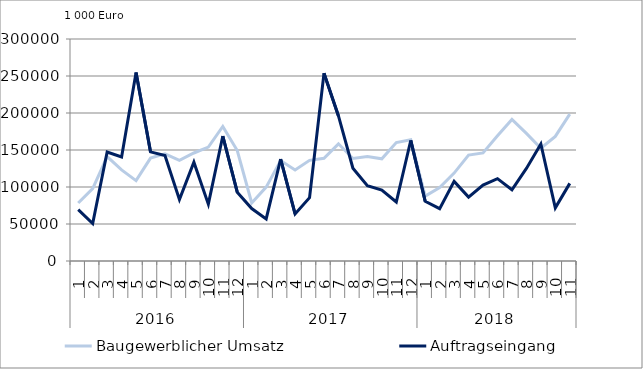
| Category | Baugewerblicher Umsatz | Auftragseingang |
|---|---|---|
| 0 | 78291.738 | 69470.357 |
| 1 | 97863.379 | 50640.033 |
| 2 | 141176.119 | 147206.65 |
| 3 | 123121.297 | 140579.009 |
| 4 | 108561.124 | 254739.334 |
| 5 | 139030.209 | 147481.644 |
| 6 | 144784.416 | 142609.658 |
| 7 | 135870.195 | 83192.156 |
| 8 | 145961.738 | 133594.351 |
| 9 | 153886.826 | 76793.838 |
| 10 | 181740.037 | 168867.568 |
| 11 | 149348.138 | 93011.853 |
| 12 | 78446.78 | 70908.903 |
| 13 | 99841.908 | 56868.408 |
| 14 | 135679.867 | 137790.423 |
| 15 | 123004.403 | 63637.761 |
| 16 | 136010.071 | 85644.63 |
| 17 | 138859.308 | 253791.552 |
| 18 | 158353.879 | 196034.198 |
| 19 | 138510.315 | 125319.873 |
| 20 | 141109.925 | 101690.626 |
| 21 | 138067.098 | 95966.626 |
| 22 | 160064.454 | 79701.993 |
| 23 | 163969.017 | 162878.607 |
| 24 | 87640.529 | 80684.627 |
| 25 | 99259.455 | 70746.763 |
| 26 | 118764.324 | 107538.747 |
| 27 | 143144.178 | 86374.619 |
| 28 | 146070.782 | 102661.329 |
| 29 | 169150.753 | 111287.709 |
| 30 | 191277.885 | 96286.662 |
| 31 | 172425.535 | 125142.495 |
| 32 | 152354.98 | 158112.302 |
| 33 | 168372.756 | 71808.619 |
| 34 | 198558.472 | 104904.147 |